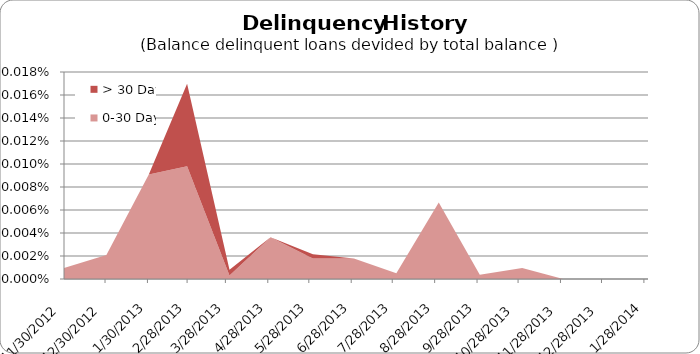
| Category | 0-30 Days | > 30 Days |
|---|---|---|
| 11/30/12 | 0 | 0 |
| 12/31/12 | 0 | 0 |
| 1/31/13 | 0 | 0 |
| 2/28/13 | 0 | 0 |
| 3/31/13 | 0 | 0 |
| 4/30/13 | 0 | 0 |
| 5/31/13 | 0 | 0 |
| 6/30/13 | 0 | 0 |
| 7/31/13 | 0 | 0 |
| 8/31/13 | 0 | 0 |
| 9/30/13 | 0 | 0 |
| 10/31/13 | 0 | 0 |
| 11/30/13 | 0 | 0 |
| 12/31/13 | 0 | 0 |
| 1/31/14 | 0 | 0 |